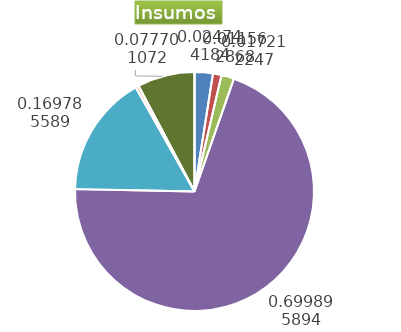
| Category | Series 0 |
|---|---|
| Control arvenses | 681576 |
| Control fitosanitario | 318498 |
| Cosecha y beneficio | 474109.554 |
| Fertilización | 19278560 |
| Instalación | 4539001.987 |
| Otros | 112883 |
| Podas | 0 |
| Riego | 0 |
| Transporte | 2140268 |
| Tutorado | 0 |